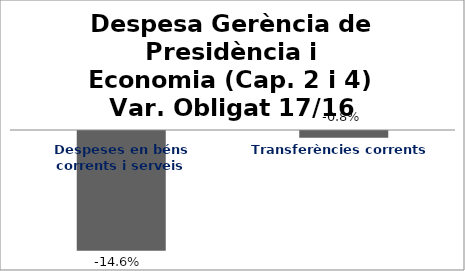
| Category | Series 0 |
|---|---|
| Despeses en béns corrents i serveis | -0.146 |
| Transferències corrents | -0.008 |